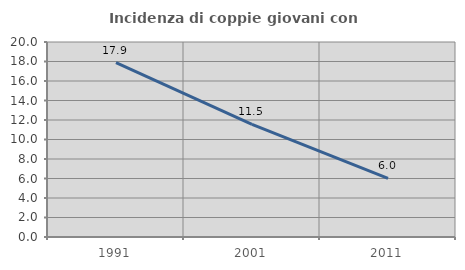
| Category | Incidenza di coppie giovani con figli |
|---|---|
| 1991.0 | 17.884 |
| 2001.0 | 11.541 |
| 2011.0 | 6.005 |